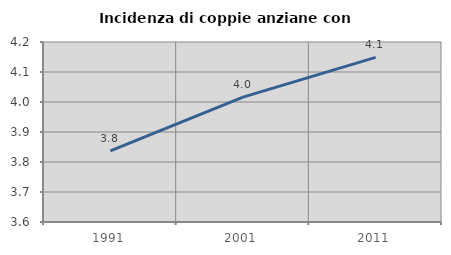
| Category | Incidenza di coppie anziane con figli |
|---|---|
| 1991.0 | 3.837 |
| 2001.0 | 4.016 |
| 2011.0 | 4.149 |